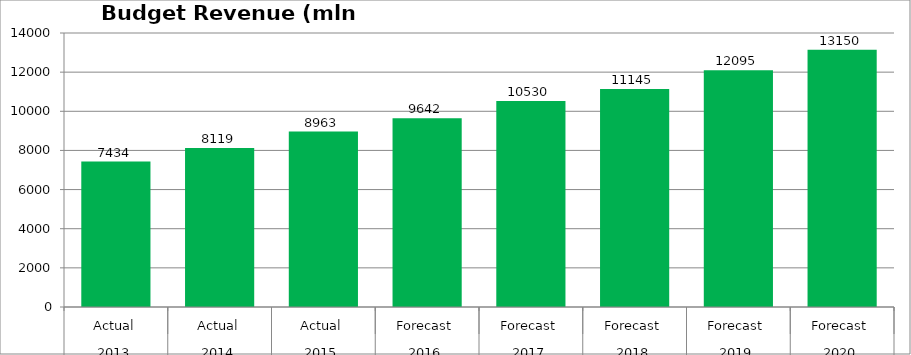
| Category | Budget Revenue (mln GEL) |
|---|---|
| 0 | 7434.152 |
| 1 | 8118.838 |
| 2 | 8963.173 |
| 3 | 9642 |
| 4 | 10530 |
| 5 | 11145 |
| 6 | 12095 |
| 7 | 13150 |